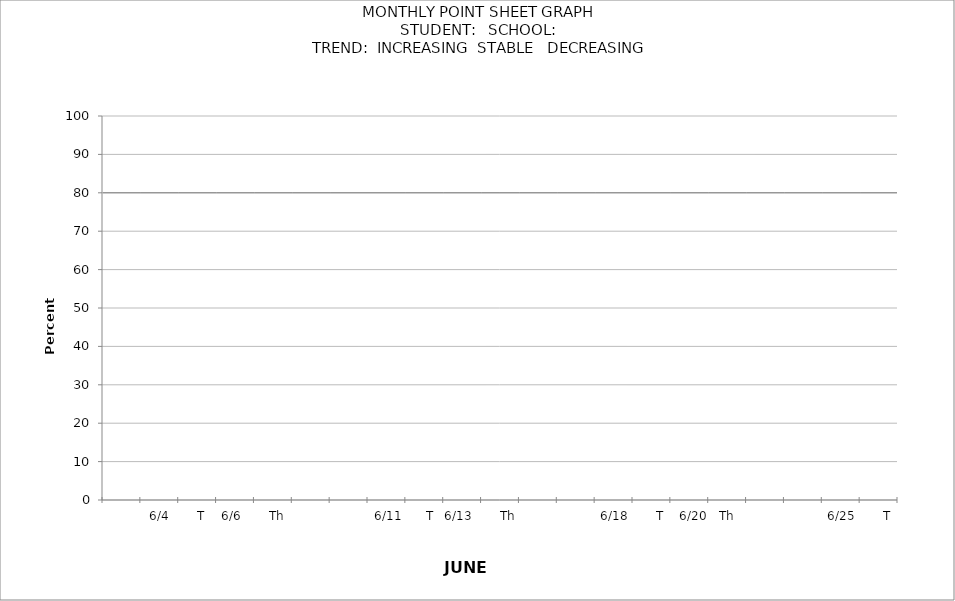
| Category | PERCENTAGE | target |
|---|---|---|
|  |  | 80 |
| 6/3       M |  | 80 |
| 6/4       T |  | 80 |
| 6/5       W |  | 80 |
| 6/6       Th |  | 80 |
| 6/7        F |  | 80 |
|  |  | 80 |
| 6/10      M |  | 80 |
| 6/11      T |  | 80 |
| 6/12       W |  | 80 |
| 6/13       Th |  | 80 |
| 6/14        F |  | 80 |
|  |  | 80 |
| 6/17       M |  | 80 |
| 6/18       T |  | 80 |
| 6/19      W |  | 80 |
| 6/20   Th |  | 80 |
| 6/21        F |  | 80 |
|  |  | 80 |
| 6/24      M |  | 80 |
| 6/25       T |  | 80 |
| 6/26      W |  | 80 |